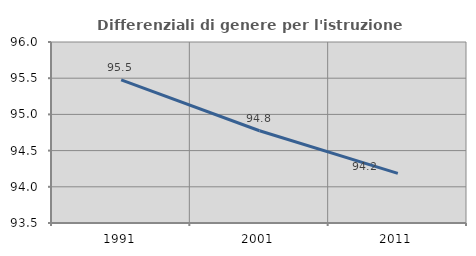
| Category | Differenziali di genere per l'istruzione superiore |
|---|---|
| 1991.0 | 95.477 |
| 2001.0 | 94.774 |
| 2011.0 | 94.186 |